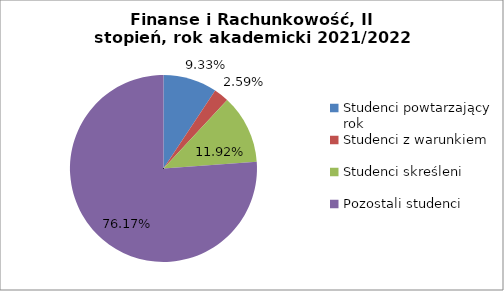
| Category | Series 0 |
|---|---|
| Studenci powtarzający rok | 18 |
| Studenci z warunkiem | 5 |
| Studenci skreśleni | 23 |
| Pozostali studenci | 147 |